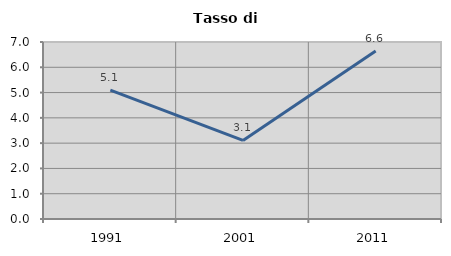
| Category | Tasso di disoccupazione   |
|---|---|
| 1991.0 | 5.1 |
| 2001.0 | 3.106 |
| 2011.0 | 6.643 |